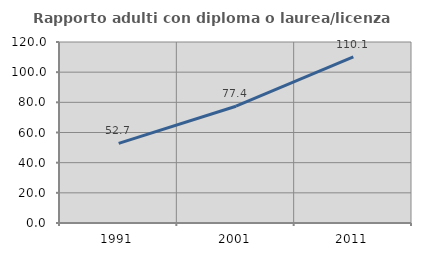
| Category | Rapporto adulti con diploma o laurea/licenza media  |
|---|---|
| 1991.0 | 52.744 |
| 2001.0 | 77.435 |
| 2011.0 | 110.099 |